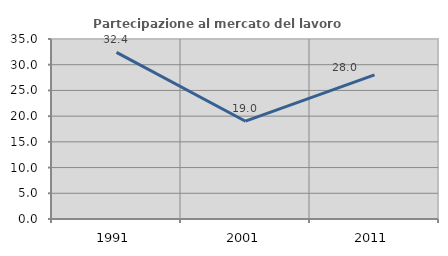
| Category | Partecipazione al mercato del lavoro  femminile |
|---|---|
| 1991.0 | 32.39 |
| 2001.0 | 19.016 |
| 2011.0 | 28.021 |